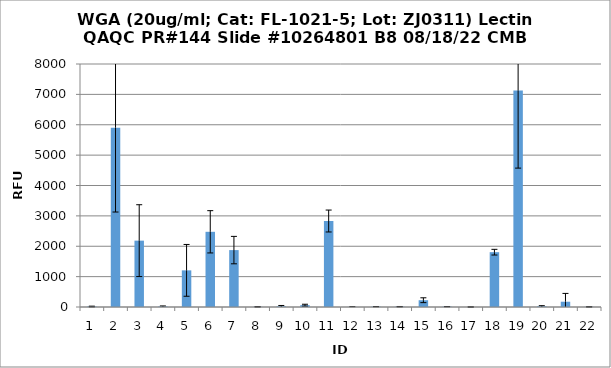
| Category | Series 0 |
|---|---|
| 0 | 15.5 |
| 1 | 5904.25 |
| 2 | 2184.75 |
| 3 | 16 |
| 4 | 1206.25 |
| 5 | 2475.5 |
| 6 | 1873.5 |
| 7 | 5.75 |
| 8 | 20.75 |
| 9 | 59.75 |
| 10 | 2830.75 |
| 11 | 3.25 |
| 12 | 12 |
| 13 | 10.25 |
| 14 | 223.25 |
| 15 | 11.75 |
| 16 | -1.75 |
| 17 | 1804.75 |
| 18 | 7125.5 |
| 19 | 21.25 |
| 20 | 173.75 |
| 21 | 4.5 |